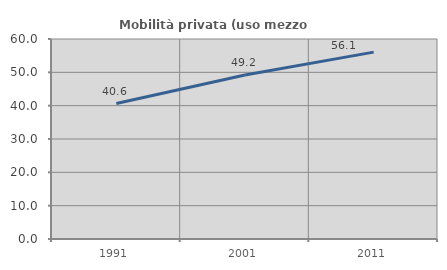
| Category | Mobilità privata (uso mezzo privato) |
|---|---|
| 1991.0 | 40.632 |
| 2001.0 | 49.201 |
| 2011.0 | 56.067 |